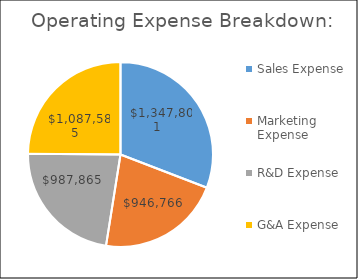
| Category | Series 1 |
|---|---|
| Sales Expense | 1347800.844 |
| Marketing Expense | 946765.75 |
| R&D Expense | 987864.563 |
| G&A Expense | 1087584.95 |